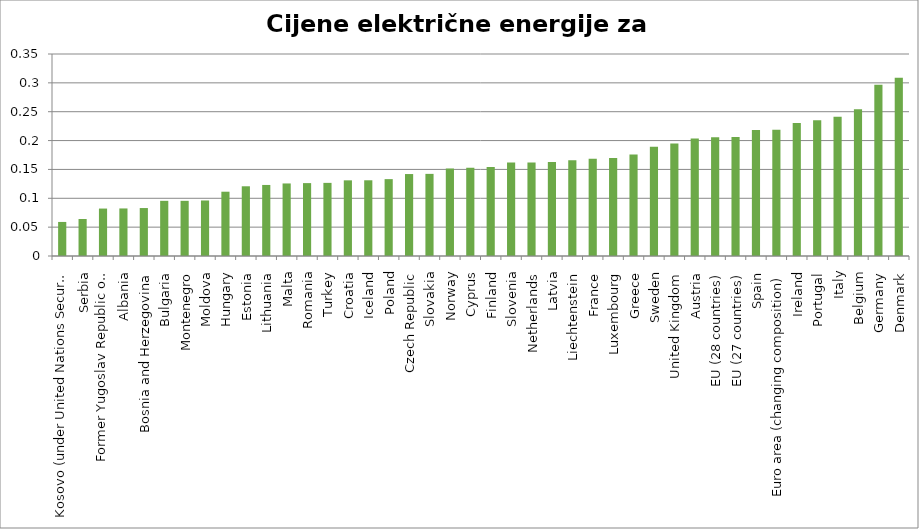
| Category | 2016 |
|---|---|
| Kosovo (under United Nations Security Council Resolution 1244/99) | 0.059 |
| Serbia | 0.064 |
| Former Yugoslav Republic of Macedonia, the | 0.082 |
| Albania | 0.082 |
| Bosnia and Herzegovina | 0.083 |
| Bulgaria | 0.096 |
| Montenegro | 0.096 |
| Moldova | 0.096 |
| Hungary | 0.111 |
| Estonia | 0.121 |
| Lithuania | 0.123 |
| Malta | 0.126 |
| Romania | 0.126 |
| Turkey | 0.127 |
| Croatia | 0.131 |
| Iceland | 0.131 |
| Poland | 0.133 |
| Czech Republic | 0.142 |
| Slovakia | 0.142 |
| Norway | 0.152 |
| Cyprus | 0.153 |
| Finland | 0.154 |
| Slovenia | 0.162 |
| Netherlands | 0.162 |
| Latvia | 0.163 |
| Liechtenstein | 0.166 |
| France | 0.168 |
| Luxembourg | 0.17 |
| Greece | 0.176 |
| Sweden | 0.189 |
| United Kingdom | 0.195 |
| Austria | 0.203 |
| EU (28 countries) | 0.206 |
| EU (27 countries) | 0.206 |
| Spain | 0.218 |
| Euro area (changing composition) | 0.219 |
| Ireland | 0.231 |
| Portugal | 0.235 |
| Italy | 0.241 |
| Belgium | 0.254 |
| Germany | 0.297 |
| Denmark | 0.309 |